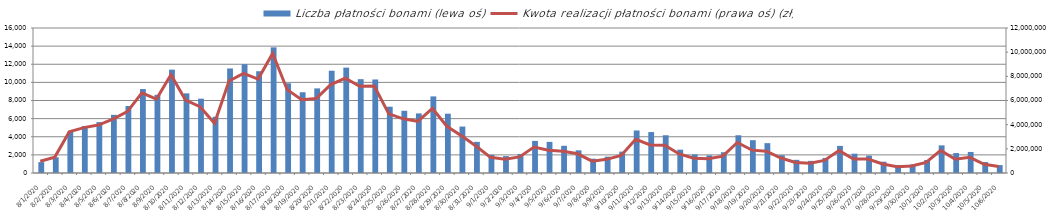
| Category | Liczba płatności bonami (lewa oś) |
|---|---|
| 8/1/20 | 1199 |
| 8/2/20 | 1736 |
| 8/3/20 | 4575 |
| 8/4/20 | 5190 |
| 8/5/20 | 5616 |
| 8/6/20 | 6419 |
| 8/7/20 | 7390 |
| 8/8/20 | 9264 |
| 8/9/20 | 8628 |
| 8/10/20 | 11404 |
| 8/11/20 | 8789 |
| 8/12/20 | 8201 |
| 8/13/20 | 6210 |
| 8/14/20 | 11534 |
| 8/15/20 | 12006 |
| 8/16/20 | 11229 |
| 8/17/20 | 13867 |
| 8/18/20 | 9899 |
| 8/19/20 | 8911 |
| 8/20/20 | 9336 |
| 8/21/20 | 11285 |
| 8/22/20 | 11629 |
| 8/23/20 | 10353 |
| 8/24/20 | 10320 |
| 8/25/20 | 7314 |
| 8/26/20 | 6865 |
| 8/27/20 | 6574 |
| 8/28/20 | 8453 |
| 8/29/20 | 6545 |
| 8/30/20 | 5126 |
| 8/31/20 | 3435 |
| 9/1/20 | 2009 |
| 9/2/20 | 1865 |
| 9/3/20 | 2096 |
| 9/4/20 | 3542 |
| 9/5/20 | 3432 |
| 9/6/20 | 3003 |
| 9/7/20 | 2501 |
| 9/8/20 | 1579 |
| 9/9/20 | 1801 |
| 9/10/20 | 2354 |
| 9/11/20 | 4690 |
| 9/12/20 | 4518 |
| 9/13/20 | 4166 |
| 9/14/20 | 2576 |
| 9/15/20 | 2051 |
| 9/16/20 | 1944 |
| 9/17/20 | 2291 |
| 9/18/20 | 4162 |
| 9/19/20 | 3622 |
| 9/20/20 | 3294 |
| 9/21/20 | 1961 |
| 9/22/20 | 1453 |
| 9/23/20 | 1338 |
| 9/24/20 | 1663 |
| 9/25/20 | 2991 |
| 9/26/20 | 2128 |
| 9/27/20 | 1921 |
| 9/28/20 | 1246 |
| 9/29/20 | 883 |
| 9/30/20 | 952 |
| 10/1/20 | 1436 |
| 10/2/20 | 3049 |
| 10/3/20 | 2199 |
| 10/4/20 | 2322 |
| 10/5/20 | 1208 |
| 10/6/20 | 872 |